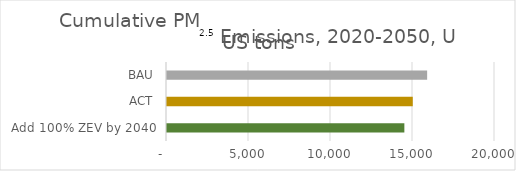
| Category | Cumulative PM2.5 Emissions, 2020-2050, US tons |
|---|---|
| Add 100% ZEV by 2040 | 14473.188 |
| ACT | 14986 |
| BAU | 15862 |